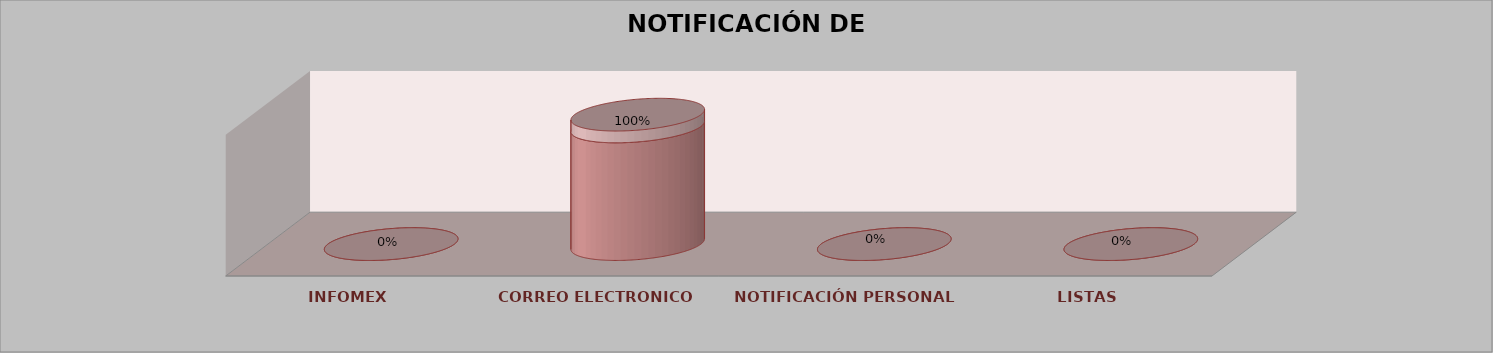
| Category | Series 0 | Series 1 | Series 2 | Series 3 | Series 4 |
|---|---|---|---|---|---|
| INFOMEX |  |  |  | 0 | 0 |
| CORREO ELECTRONICO |  |  |  | 10 | 1 |
| NOTIFICACIÓN PERSONAL |  |  |  | 0 | 0 |
| LISTAS |  |  |  | 0 | 0 |